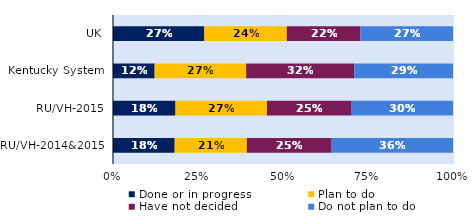
| Category | Done or in progress | Plan to do | Have not decided | Do not plan to do |
|---|---|---|---|---|
| UK | 0.269 | 0.243 | 0.217 | 0.272 |
| Kentucky System | 0.123 | 0.269 | 0.318 | 0.29 |
| RU/VH-2015 | 0.184 | 0.269 | 0.249 | 0.298 |
| RU/VH-2014&2015 | 0.181 | 0.212 | 0.25 | 0.357 |